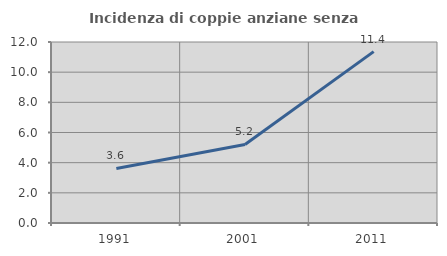
| Category | Incidenza di coppie anziane senza figli  |
|---|---|
| 1991.0 | 3.614 |
| 2001.0 | 5.208 |
| 2011.0 | 11.364 |